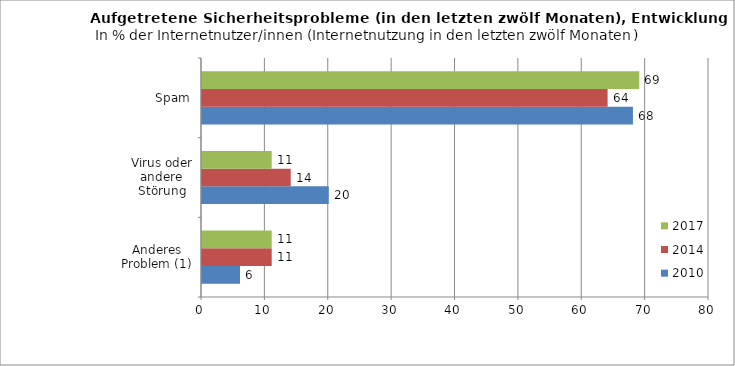
| Category | 2010 | 2014 | 2017 |
|---|---|---|---|
| Anderes Problem (1) | 6 | 11 | 11 |
| Virus oder andere Störung | 20 | 14 | 11 |
| Spam | 68 | 64 | 69 |